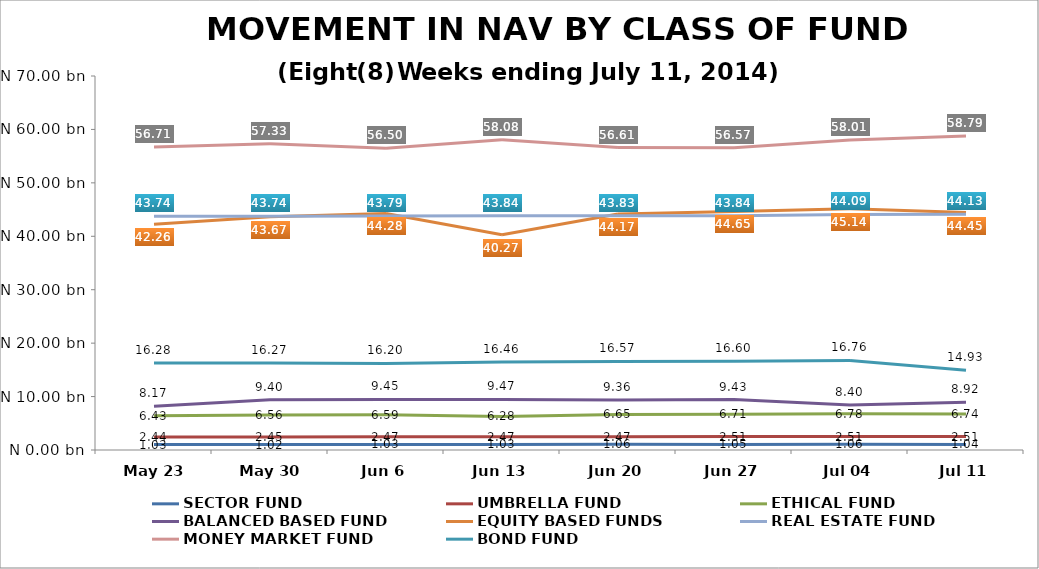
| Category | SECTOR FUND | UMBRELLA FUND | ETHICAL FUND | BALANCED BASED FUND | EQUITY BASED FUNDS | REAL ESTATE FUND | MONEY MARKET FUND |
|---|---|---|---|---|---|---|---|
| May 23 | 1025264208.42 | 2438597753.43 | 6427911719.67 | 8171109725.12 | 42258971251.85 | 43741993151.79 | 56708993290.46 |
| May 30 | 1021289702.93 | 2446182986.26 | 6562254134.47 | 9395033807.29 | 43671054168.93 | 43742541179.17 | 57330946869.59 |
| Jun 6 | 1030164100.74 | 2467888176.15 | 6587905097.38 | 9454640527.01 | 44282916360.49 | 43785178501.09 | 56495799126.24 |
| Jun 13 | 1033277583.42 | 2471211213.57 | 6282186228.74 | 9473426330.39 | 40273643798.28 | 43836588830.58 | 58082578856.2 |
| Jun 20 | 1060975294.83 | 2472945090.68 | 6648334252.76 | 9362706781.8 | 44168654011.15 | 43832653528.89 | 56609470711.8 |
| Jun 27 | 1048453031.38 | 2506730203.57 | 6709483264.48 | 9434671571.2 | 44645002968 | 43840532218.78 | 56569080675.065 |
| Jul 04 | 1062604515.76 | 2507515527.31 | 6782132168.51 | 8399458508.45 | 45140738605.71 | 44089298623.77 | 58008676427.91 |
| Jul 11 | 1037518304.47 | 2508170028.98 | 6738941158.08 | 8922391287.22 | 44448643178.1 | 44125304199.09 | 58785439864.22 |